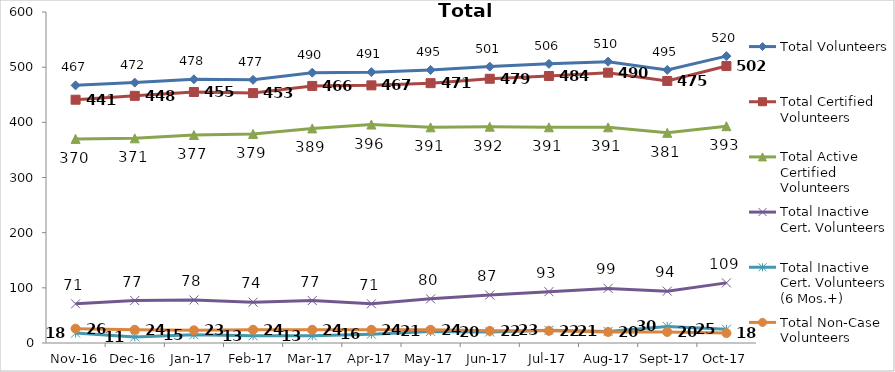
| Category | Total Volunteers | Total Certified Volunteers | Total Active Certified Volunteers | Total Inactive Cert. Volunteers | Total Inactive Cert. Volunteers (6 Mos.+) | Total Non-Case Volunteers |
|---|---|---|---|---|---|---|
| 2016-11-01 | 467 | 441 | 370 | 71 | 18 | 26 |
| 2016-12-01 | 472 | 448 | 371 | 77 | 11 | 24 |
| 2017-01-01 | 478 | 455 | 377 | 78 | 15 | 23 |
| 2017-02-01 | 477 | 453 | 379 | 74 | 13 | 24 |
| 2017-03-01 | 490 | 466 | 389 | 77 | 13 | 24 |
| 2017-04-01 | 491 | 467 | 396 | 71 | 16 | 24 |
| 2017-05-01 | 495 | 471 | 391 | 80 | 21 | 24 |
| 2017-06-01 | 501 | 479 | 392 | 87 | 20 | 22 |
| 2017-07-01 | 506 | 484 | 391 | 93 | 23 | 22 |
| 2017-08-01 | 510 | 490 | 391 | 99 | 21 | 20 |
| 2017-09-01 | 495 | 475 | 381 | 94 | 30 | 20 |
| 2017-10-01 | 520 | 502 | 393 | 109 | 25 | 18 |